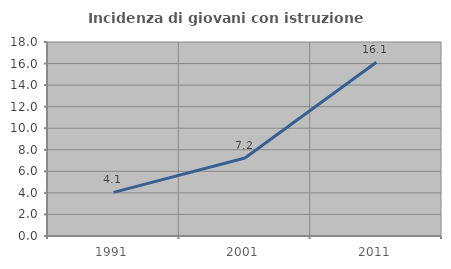
| Category | Incidenza di giovani con istruzione universitaria |
|---|---|
| 1991.0 | 4.052 |
| 2001.0 | 7.235 |
| 2011.0 | 16.114 |